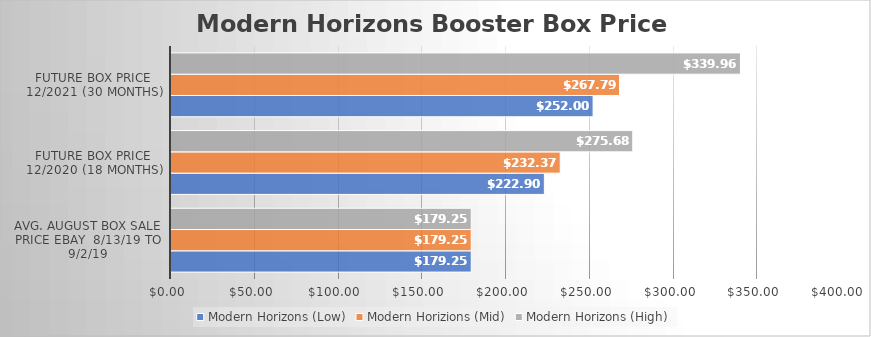
| Category | Modern Horizons (Low) | Modern Horizions (Mid) | Modern Horizons (High) |
|---|---|---|---|
| Avg. August Box Sale Price Ebay  8/13/19 to 9/2/19 | 179.25 | 179.25 | 179.25 |
| Future Box Price 12/2020 (18 months) | 222.9 | 232.373 | 275.675 |
| Future Box Price 12/2021 (30 months) | 252 | 267.788 | 339.959 |